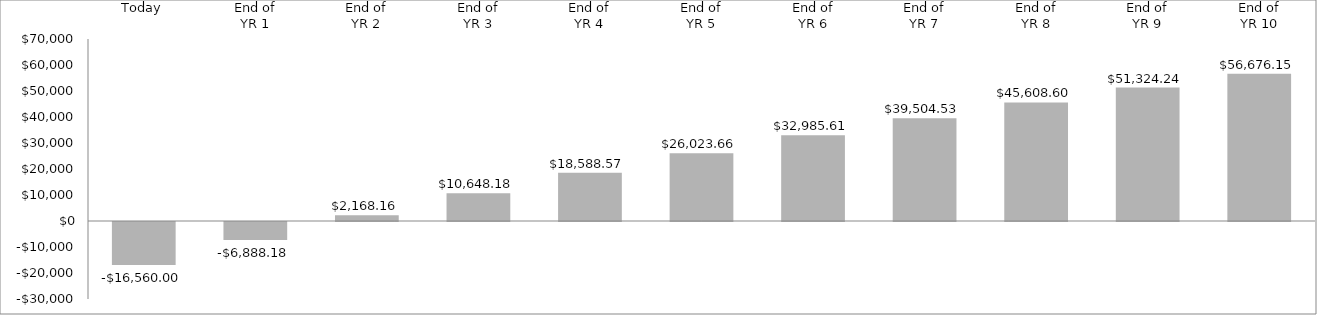
| Category | ($16,560.00) $9,672  $9,056  $8,480  $7,940  $7,435  $6,962  $6,519  $6,104  $5,716  $5,352  |
|---|---|
| Today | -16560 |
| End of
YR 1 | -6888.182 |
| End of
YR 2 | 2168.157 |
| End of
YR 3 | 10648.183 |
| End of
YR 4 | 18588.572 |
| End of
YR 5 | 26023.663 |
| End of
YR 6 | 32985.611 |
| End of
YR 7 | 39504.527 |
| End of
YR 8 | 45608.603 |
| End of
YR 9 | 51324.237 |
| End of
YR 10 | 56676.149 |